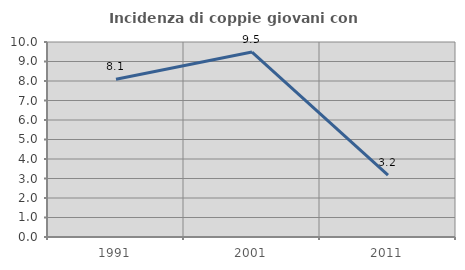
| Category | Incidenza di coppie giovani con figli |
|---|---|
| 1991.0 | 8.088 |
| 2001.0 | 9.483 |
| 2011.0 | 3.175 |